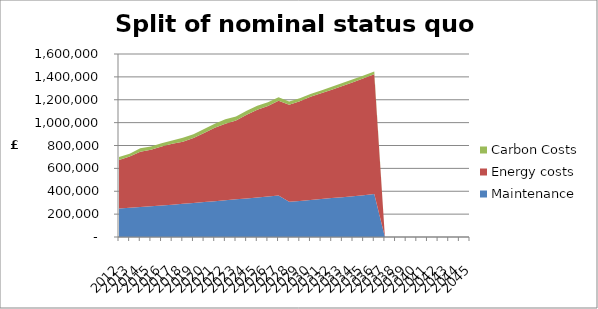
| Category | Maintenance | Energy costs | Carbon Costs |
|---|---|---|---|
| 2012.0 | 249882.068 | 423898.789 | 24621.928 |
| 2013.0 | 256129.12 | 447472.975 | 24098.057 |
| 2014.0 | 262532.348 | 482656.619 | 30035.259 |
| 2015.0 | 269113.862 | 492846.864 | 30035.259 |
| 2016.0 | 275841.709 | 514465.596 | 28638.27 |
| 2017.0 | 282737.751 | 533225.502 | 27939.776 |
| 2018.0 | 289806.195 | 543338.067 | 34051.602 |
| 2019.0 | 297071.447 | 568480.045 | 32305.366 |
| 2020.0 | 305897.682 | 602688.939 | 36016.118 |
| 2021.0 | 313545.124 | 642534.683 | 33833.322 |
| 2022.0 | 321383.752 | 668013.482 | 39290.31 |
| 2023.0 | 329440.632 | 688736.207 | 35361.279 |
| 2024.0 | 337676.648 | 731288.41 | 35361.279 |
| 2025.0 | 346118.564 | 766342.073 | 35361.279 |
| 2026.0 | 354771.528 | 789963.763 | 32741.925 |
| 2027.0 | 363665.417 | 826829.227 | 31432.248 |
| 2028.0 | 307954.766 | 848066.645 | 28812.894 |
| 2029.0 | 315653.636 | 870835.858 | 27503.217 |
| 2030.0 | 323544.977 | 902712.551 | 24883.863 |
| 2031.0 | 331656.037 | 925342.963 | 24883.863 |
| 2032.0 | 339947.438 | 948476.538 | 24883.863 |
| 2033.0 | 348446.124 | 972188.451 | 24883.863 |
| 2034.0 | 357157.277 | 996493.162 | 24883.863 |
| 2035.0 | 366110.976 | 1021474.593 | 24883.863 |
| 2036.0 | 375263.75 | 1047011.458 | 24883.863 |
| 2037.0 | 0 | 0 | 0 |
| 2038.0 | 0 | 0 | 0 |
| 2039.0 | 0 | 0 | 0 |
| 2040.0 | 0 | 0 | 0 |
| 2041.0 | 0 | 0 | 0 |
| 2042.0 | 0 | 0 | 0 |
| 2043.0 | 0 | 0 | 0 |
| 2044.0 | 0 | 0 | 0 |
| 2045.0 | 0 | 0 | 0 |